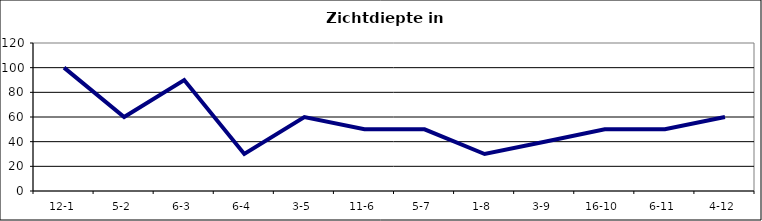
| Category | Zichtdiepte in cm |
|---|---|
| 12-1 | 100 |
| 5-2 | 60 |
| 6-3 | 90 |
| 6-4 | 30 |
| 3-5 | 60 |
| 11-6 | 50 |
| 5-7 | 50 |
| 1-8 | 30 |
| 3-9 | 40 |
| 16-10 | 50 |
| 6-11 | 50 |
| 4-12 | 60 |